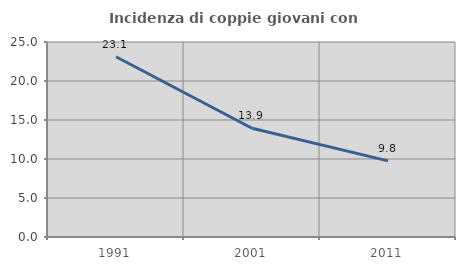
| Category | Incidenza di coppie giovani con figli |
|---|---|
| 1991.0 | 23.109 |
| 2001.0 | 13.941 |
| 2011.0 | 9.756 |